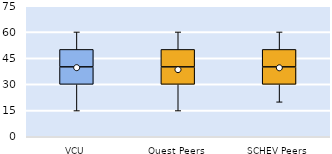
| Category | 25th | 50th | 75th |
|---|---|---|---|
| VCU | 30 | 10 | 10 |
| Quest Peers | 30 | 10 | 10 |
| SCHEV Peers | 30 | 10 | 10 |